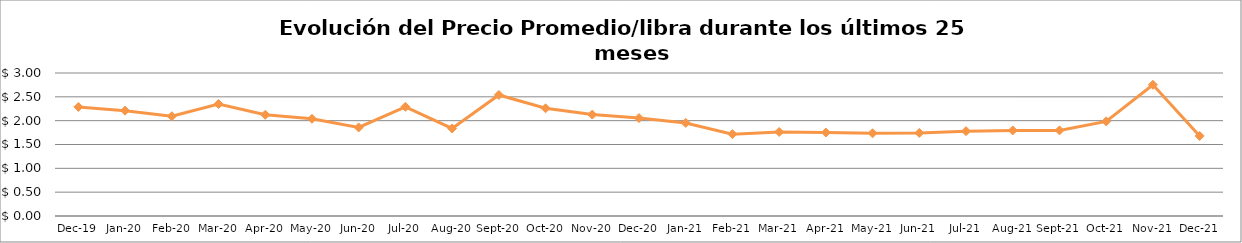
| Category | Series 0 |
|---|---|
| 2019-12-01 | 2.288 |
| 2020-01-01 | 2.21 |
| 2020-02-01 | 2.093 |
| 2020-03-01 | 2.349 |
| 2020-04-01 | 2.124 |
| 2020-05-01 | 2.039 |
| 2020-06-01 | 1.858 |
| 2020-07-01 | 2.291 |
| 2020-08-01 | 1.837 |
| 2020-09-01 | 2.54 |
| 2020-10-01 | 2.26 |
| 2020-11-01 | 2.127 |
| 2020-12-01 | 2.055 |
| 2021-01-01 | 1.952 |
| 2021-02-01 | 1.717 |
| 2021-03-01 | 1.764 |
| 2021-04-01 | 1.751 |
| 2021-05-01 | 1.736 |
| 2021-06-01 | 1.743 |
| 2021-07-01 | 1.78 |
| 2021-08-01 | 1.795 |
| 2021-09-01 | 1.796 |
| 2021-10-01 | 1.985 |
| 2021-11-01 | 2.753 |
| 2021-12-01 | 1.68 |